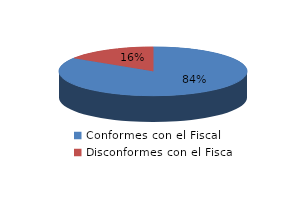
| Category | Series 0 |
|---|---|
| 0 | 159 |
| 1 | 30 |